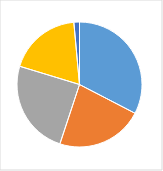
| Category | Series 0 |
|---|---|
| 0 | 0.326 |
| 1 | 0.225 |
| 2 | 0.246 |
| 3 | 0.188 |
| 4 | 0.014 |